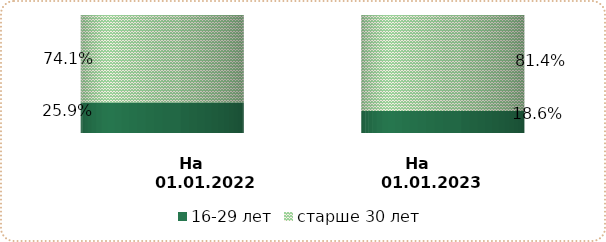
| Category | 16-29 лет | старше 30 лет |
|---|---|---|
| на 
01.01.2022 | 0.259 | 0.741 |
| на 
01.01.2023 | 0.186 | 0.814 |